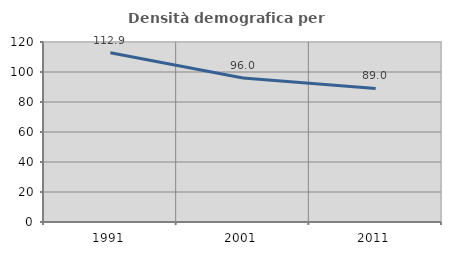
| Category | Densità demografica |
|---|---|
| 1991.0 | 112.884 |
| 2001.0 | 95.968 |
| 2011.0 | 89.047 |